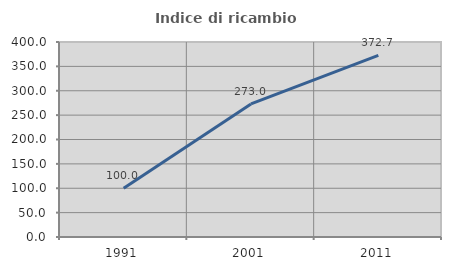
| Category | Indice di ricambio occupazionale  |
|---|---|
| 1991.0 | 100 |
| 2001.0 | 272.973 |
| 2011.0 | 372.727 |